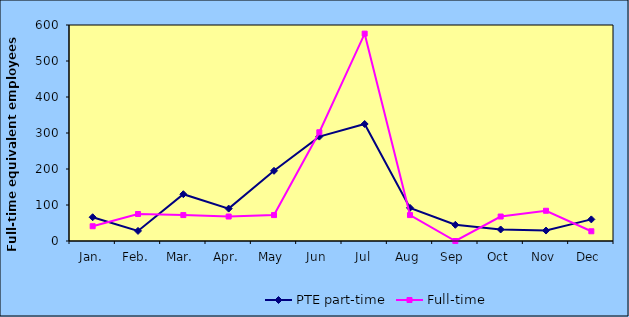
| Category | PTE part-time | Full-time |
|---|---|---|
| Jan. | 66 | 41 |
| Feb. | 28 | 75 |
| Mar. | 130 | 72 |
| Apr. | 90 | 68 |
| May | 195 | 72 |
| Jun | 290 | 302 |
| Jul | 325 | 576 |
| Aug | 92 | 72 |
| Sep | 45 | 0 |
| Oct | 32 | 68 |
| Nov | 29 | 84 |
| Dec | 60 | 27 |